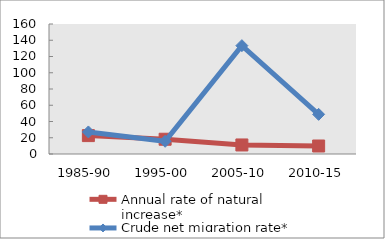
| Category | Annual rate of natural increase* | Crude net migration rate* |
|---|---|---|
| 1985-90 | 22.642 | 27.145 |
| 1995-00 | 18.158 | 15.652 |
| 2005-10 | 11.12 | 133.354 |
| 2010-15 | 9.837 | 48.777 |